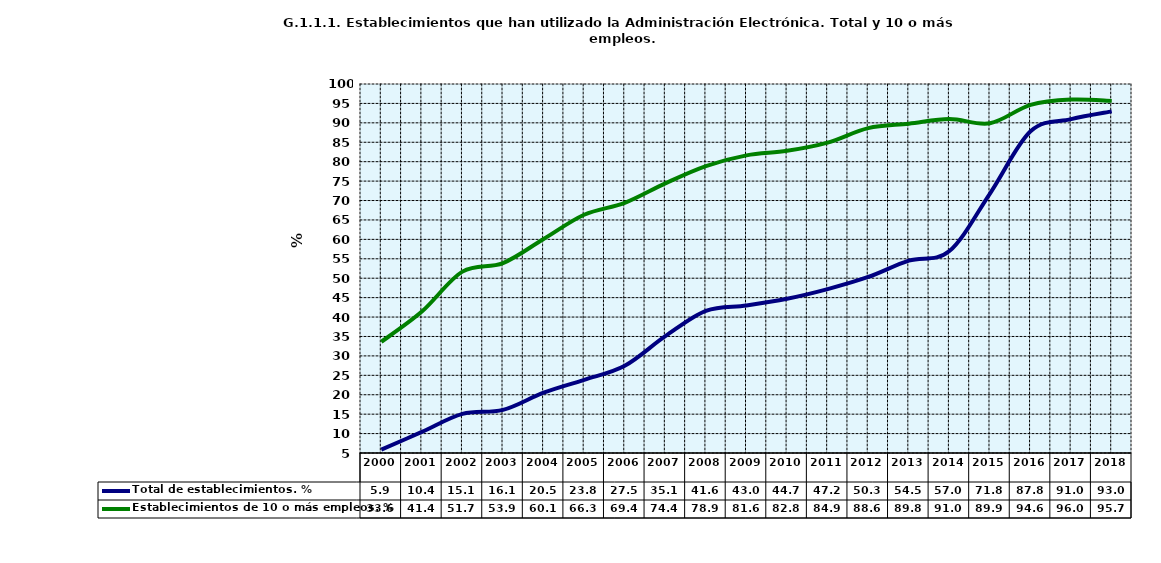
| Category | Total de establecimientos. % | Establecimientos de 10 o más empleos. % |
|---|---|---|
| 2000.0 | 5.883 | 33.627 |
| 2001.0 | 10.421 | 41.411 |
| 2002.0 | 15.068 | 51.694 |
| 2003.0 | 16.098 | 53.904 |
| 2004.0 | 20.515 | 60.107 |
| 2005.0 | 23.837 | 66.349 |
| 2006.0 | 27.46 | 69.402 |
| 2007.0 | 35.078 | 74.42 |
| 2008.0 | 41.612 | 78.862 |
| 2009.0 | 42.972 | 81.627 |
| 2010.0 | 44.715 | 82.794 |
| 2011.0 | 47.2 | 84.9 |
| 2012.0 | 50.321 | 88.639 |
| 2013.0 | 54.524 | 89.774 |
| 2014.0 | 56.986 | 90.972 |
| 2015.0 | 71.8 | 89.9 |
| 2016.0 | 87.813 | 94.63 |
| 2017.0 | 90.959 | 95.981 |
| 2018.0 | 92.961 | 95.655 |